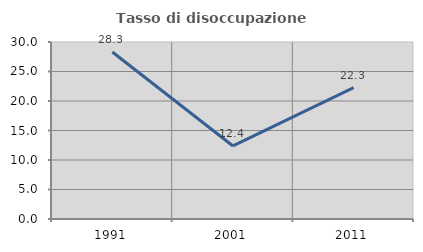
| Category | Tasso di disoccupazione giovanile  |
|---|---|
| 1991.0 | 28.315 |
| 2001.0 | 12.378 |
| 2011.0 | 22.264 |